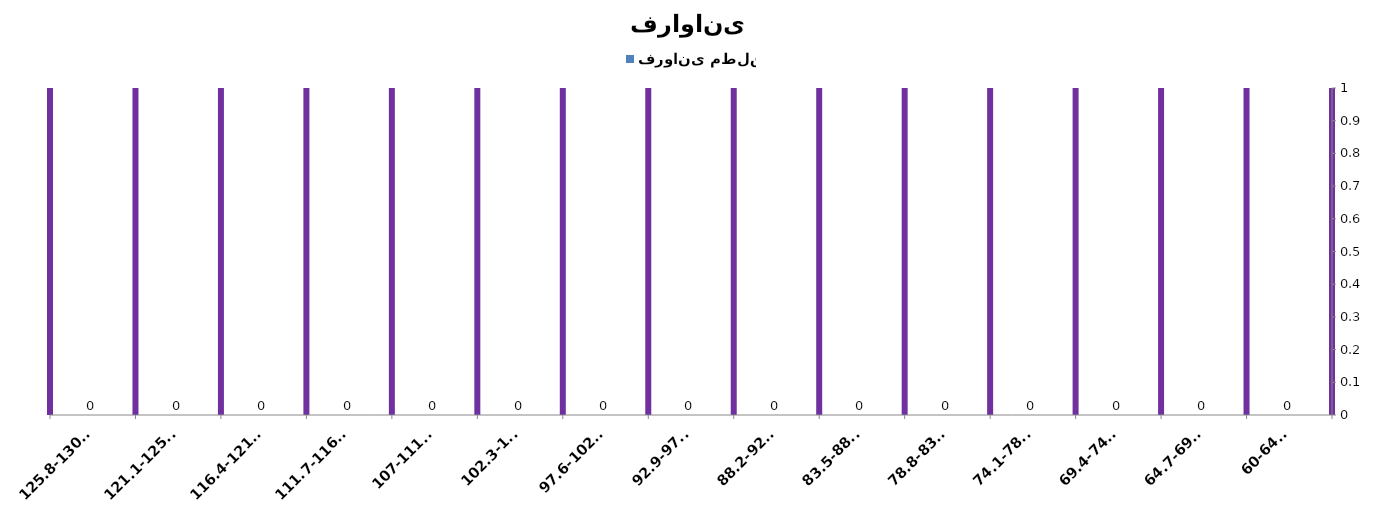
| Category | فروانی مطلق |
|---|---|
| 60-64.7 | 2 |
| 64.7-69.4 | 4 |
| 69.4-74.1 | 6 |
| 74.1-78.8 | 4 |
| 78.8-83.5 | 7 |
| 83.5-88.2 | 8 |
| 88.2-92.9 | 12 |
| 92.9-97.6 | 9 |
| 97.6-102.3 | 16 |
| 102.3-107 | 11 |
| 107-111.7 | 10 |
| 111.7-116.4 | 7 |
| 116.4-121.1 | 3 |
| 121.1-125.8 | 3 |
| 125.8-130.5 | 3 |